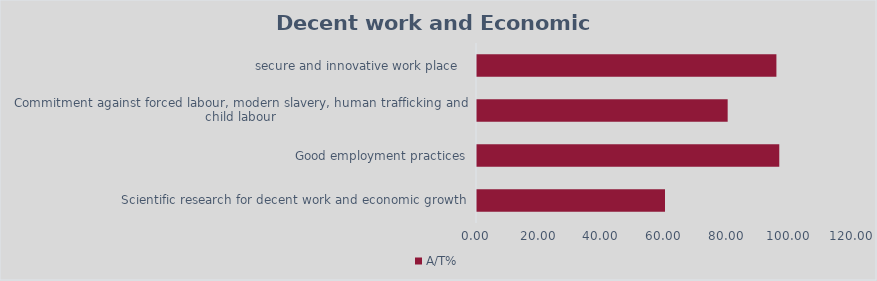
| Category | A/T% |
|---|---|
| Scientific research for decent work and economic growth | 60 |
| Good employment practices | 96.471 |
| Commitment against forced labour, modern slavery, human trafficking and child labour | 80 |
|  secure and innovative work place   | 95.556 |